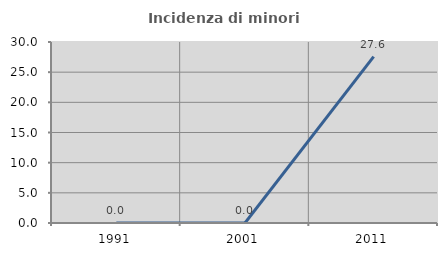
| Category | Incidenza di minori stranieri |
|---|---|
| 1991.0 | 0 |
| 2001.0 | 0 |
| 2011.0 | 27.586 |